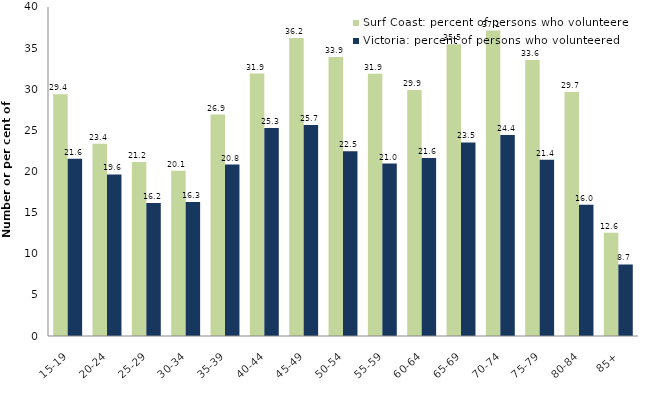
| Category | Surf Coast: percent of persons who volunteered | Victoria: percent of persons who volunteered |
|---|---|---|
| 15-19 | 29.392 | 21.556 |
| 20-24 | 23.36 | 19.639 |
| 25-29 | 21.16 | 16.158 |
| 30-34 | 20.103 | 16.304 |
| 35-39 | 26.925 | 20.84 |
| 40-44 | 31.906 | 25.304 |
| 45-49 | 36.222 | 25.652 |
| 50-54 | 33.907 | 22.455 |
| 55-59 | 31.87 | 20.971 |
| 60-64 | 29.895 | 21.634 |
| 65-69 | 35.464 | 23.526 |
| 70-74 | 37.143 | 24.439 |
| 75-79 | 33.557 | 21.439 |
| 80-84 | 29.652 | 15.954 |
| 85+ | 12.551 | 8.705 |